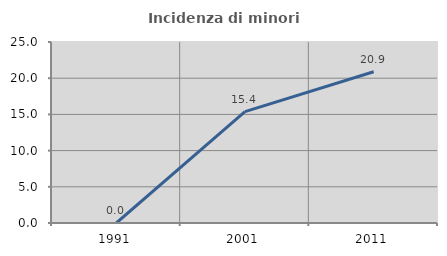
| Category | Incidenza di minori stranieri |
|---|---|
| 1991.0 | 0 |
| 2001.0 | 15.385 |
| 2011.0 | 20.896 |